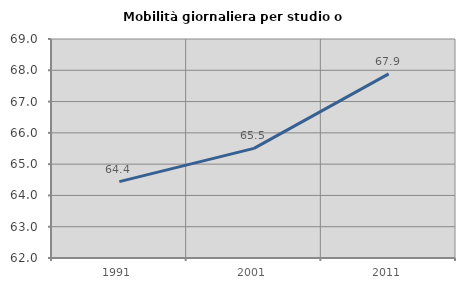
| Category | Mobilità giornaliera per studio o lavoro |
|---|---|
| 1991.0 | 64.44 |
| 2001.0 | 65.503 |
| 2011.0 | 67.884 |